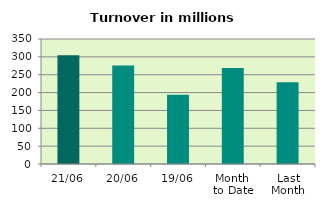
| Category | Series 0 |
|---|---|
| 21/06 | 304.693 |
| 20/06 | 275.674 |
| 19/06 | 193.648 |
| Month 
to Date | 268.715 |
| Last
Month | 228.645 |